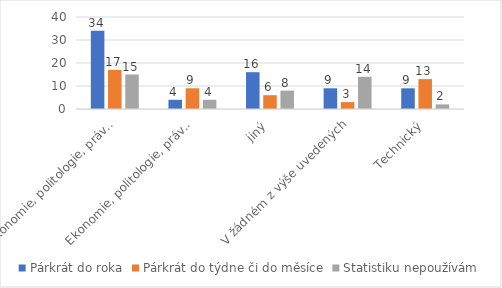
| Category | Párkrát do roka | Párkrát do týdne či do měsíce | Statistiku nepoužívám |
|---|---|---|---|
| Ekonomie, politologie, právo, psychologie, sociologie | 34 | 17 | 15 |
| Ekonomie, politologie, právo, psychologie, sociologie+jiný | 4 | 9 | 4 |
| jiný | 16 | 6 | 8 |
| V žádném z výše uvedených | 9 | 3 | 14 |
| Technický | 9 | 13 | 2 |